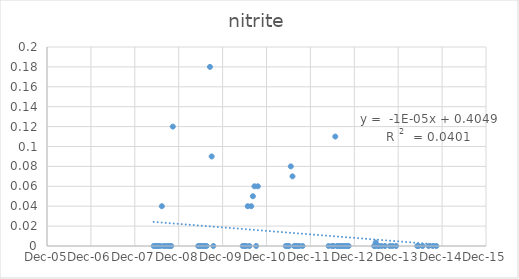
| Category | Series 0 |
|---|---|
| 39577.0 | 0 |
| 39590.0 | 0 |
| 39604.0 | 0 |
| 39618.0 | 0 |
| 39633.0 | 0 |
| 39645.0 | 0.04 |
| 39660.0 | 0 |
| 39674.0 | 0 |
| 39695.0 | 0 |
| 39710.0 | 0 |
| 39723.0 | 0 |
| 39736.0 | 0.12 |
| 39947.0 | 0 |
| 39961.0 | 0 |
| 39974.0 | 0 |
| 39989.0 | 0 |
| 40002.0 | 0 |
| 40017.0 | 0 |
| 40045.0 | 0.18 |
| 40059.0 | 0.09 |
| 40073.0 | 0 |
| 40317.0 | 0 |
| 40332.0 | 0 |
| 40346.0 | 0 |
| 40359.0 | 0.04 |
| 40374.0 | 0 |
| 40388.0 | 0.04 |
| 40402.0 | 0.05 |
| 40415.0 | 0.06 |
| 40429.0 | 0 |
| 40443.0 | 0.06 |
| 40675.0 | 0 |
| 40689.0 | 0 |
| 40702.0 | 0 |
| 40717.0 | 0.08 |
| 40731.0 | 0.07 |
| 40745.0 | 0 |
| 40759.0 | 0 |
| 40773.0 | 0 |
| 40787.0 | 0 |
| 40815.0 | 0 |
| 41031.0 | 0 |
| 41059.0 | 0 |
| 41073.0 | 0 |
| 41087.0 | 0.11 |
| 41101.0 | 0 |
| 41115.0 | 0 |
| 41129.0 | 0 |
| 41144.0 | 0 |
| 41158.0 | 0 |
| 41171.0 | 0 |
| 41186.0 | 0 |
| 41198.0 | 0 |
| 41410.0 | 0 |
| 41416.0 | 0 |
| 41423.0 | 0.004 |
| 41437.0 | 0 |
| 41450.0 | 0 |
| 41472.0 | 0 |
| 41500.0 | 0 |
| 41541.0 | 0 |
| 41563.0 | 0 |
| 41592.0 | 0 |
| 41768.0 | 0 |
| 41780.0 | 0 |
| 41814.0 | 0 |
| 41863.0 | 0 |
| 41898.0 | 0 |
| 41927.0 | 0 |